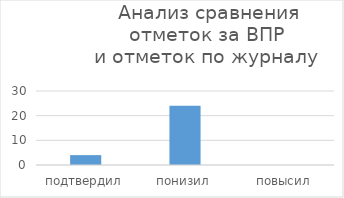
| Category | Series 0 |
|---|---|
| подтвердил | 4 |
| понизил | 24 |
| повысил | 0 |